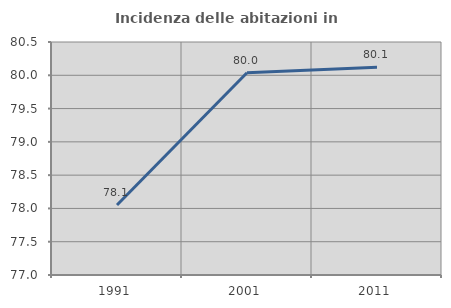
| Category | Incidenza delle abitazioni in proprietà  |
|---|---|
| 1991.0 | 78.051 |
| 2001.0 | 80.039 |
| 2011.0 | 80.119 |